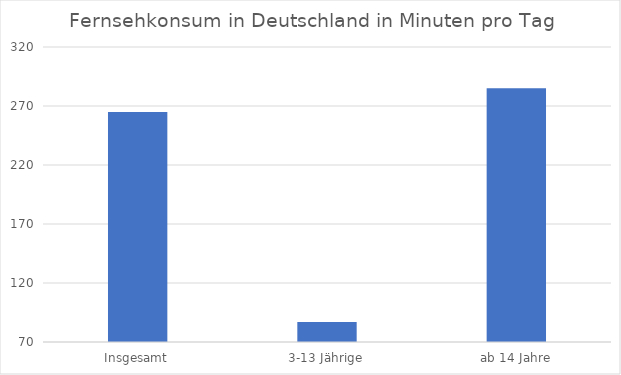
| Category | Series 0 |
|---|---|
| Insgesamt | 265 |
| 3-13 Jährige | 87 |
| ab 14 Jahre | 285 |